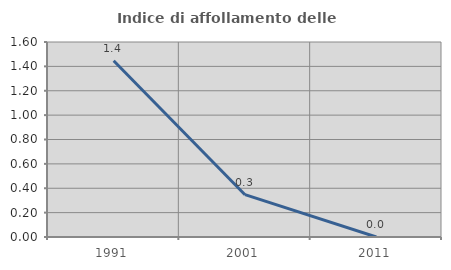
| Category | Indice di affollamento delle abitazioni  |
|---|---|
| 1991.0 | 1.446 |
| 2001.0 | 0.347 |
| 2011.0 | 0 |